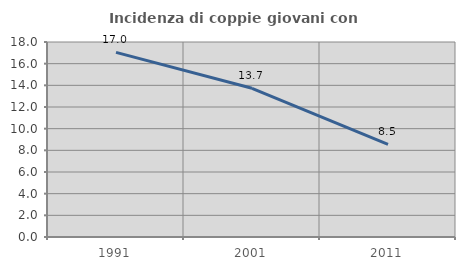
| Category | Incidenza di coppie giovani con figli |
|---|---|
| 1991.0 | 17.044 |
| 2001.0 | 13.726 |
| 2011.0 | 8.548 |